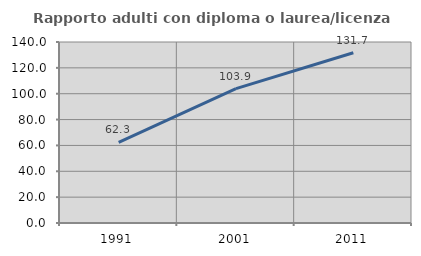
| Category | Rapporto adulti con diploma o laurea/licenza media  |
|---|---|
| 1991.0 | 62.315 |
| 2001.0 | 103.927 |
| 2011.0 | 131.69 |